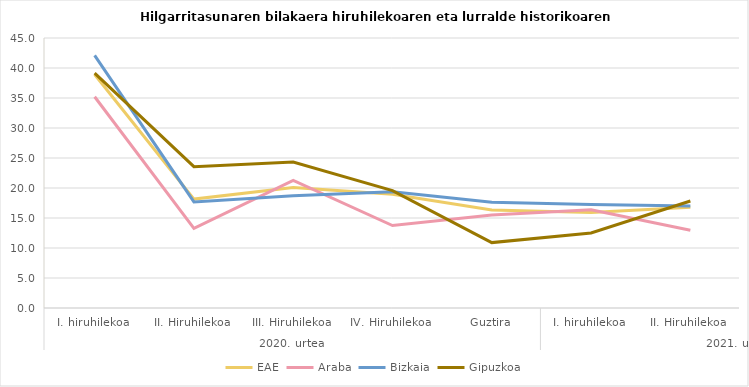
| Category | EAE | Araba | Bizkaia | Gipuzkoa |
|---|---|---|---|---|
| 0 | 38.926 | 35.211 | 42.105 | 39.13 |
| 1 | 18.149 | 13.27 | 17.682 | 23.561 |
| 2 | 20.066 | 21.25 | 18.709 | 24.324 |
| 3 | 18.94 | 13.736 | 19.367 | 19.565 |
| 4 | 16.353 | 15.517 | 17.639 | 10.897 |
| 5 | 15.934 | 16.364 | 17.241 | 12.5 |
| 6 | 16.771 | 12.963 | 17.007 | 17.829 |